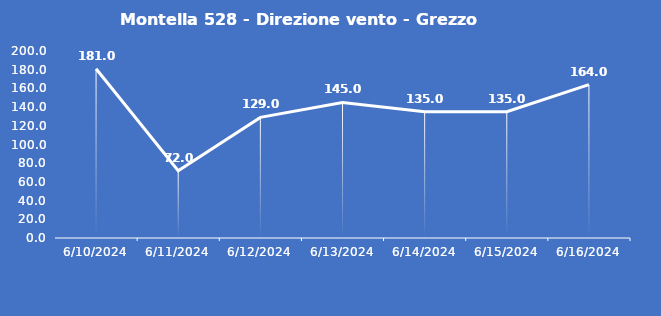
| Category | Montella 528 - Direzione vento - Grezzo (°N) |
|---|---|
| 6/10/24 | 181 |
| 6/11/24 | 72 |
| 6/12/24 | 129 |
| 6/13/24 | 145 |
| 6/14/24 | 135 |
| 6/15/24 | 135 |
| 6/16/24 | 164 |